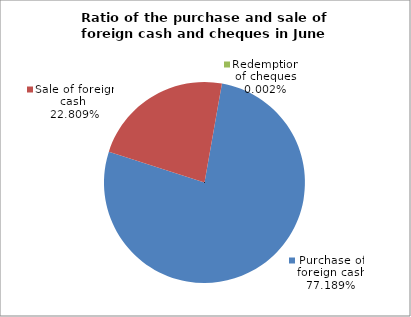
| Category | Purchase of foreign cash |
|---|---|
| 0 | 0.772 |
| 1 | 0.228 |
| 2 | 0 |